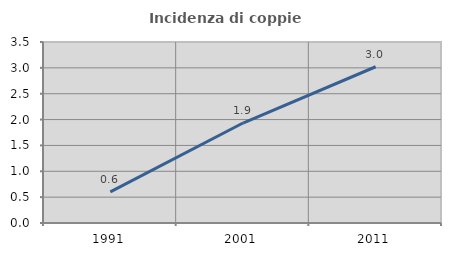
| Category | Incidenza di coppie miste |
|---|---|
| 1991.0 | 0.601 |
| 2001.0 | 1.934 |
| 2011.0 | 3.022 |